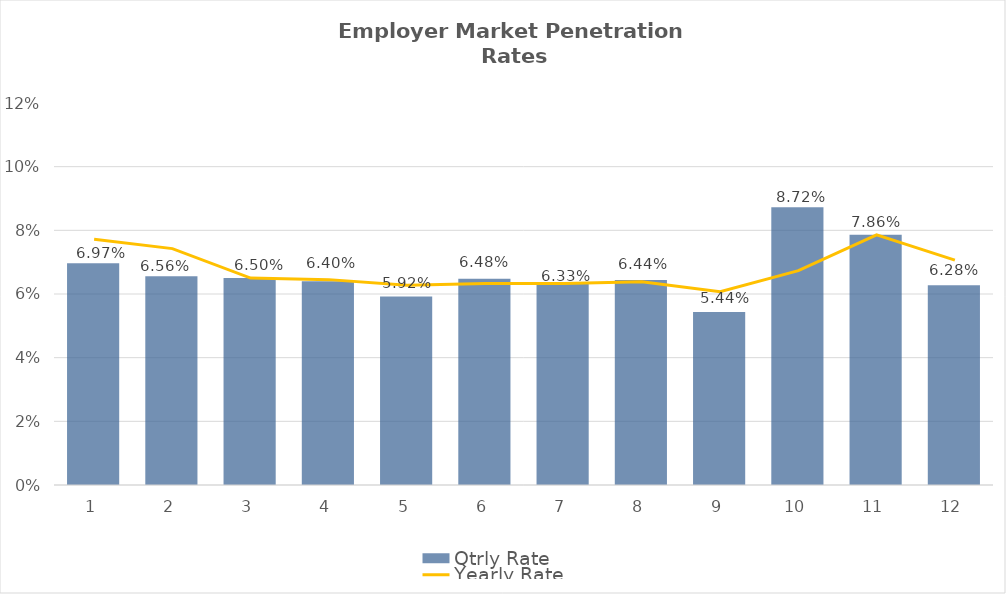
| Category | Qtrly Rate |
|---|---|
| 0 | 0.07 |
| 1 | 0.066 |
| 2 | 0.065 |
| 3 | 0.064 |
| 4 | 0.059 |
| 5 | 0.065 |
| 6 | 0.063 |
| 7 | 0.064 |
| 8 | 0.054 |
| 9 | 0.087 |
| 10 | 0.079 |
| 11 | 0.063 |